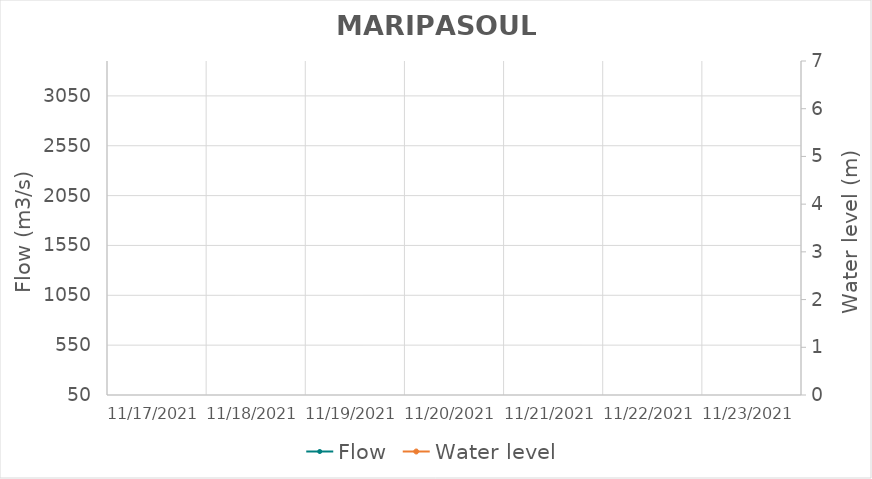
| Category | Flow |
|---|---|
| 11/1/21 | 264.99 |
| 10/31/21 | 267.29 |
| 10/30/21 | 283.44 |
| 10/29/21 | 295.62 |
| 10/28/21 | 304.87 |
| 10/27/21 | 299.3 |
| 10/26/21 | 276.5 |